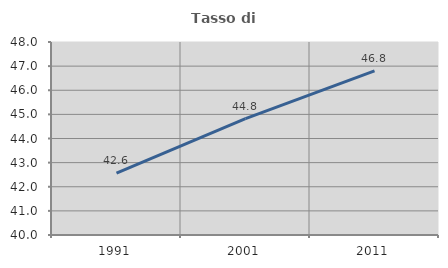
| Category | Tasso di occupazione   |
|---|---|
| 1991.0 | 42.562 |
| 2001.0 | 44.827 |
| 2011.0 | 46.804 |